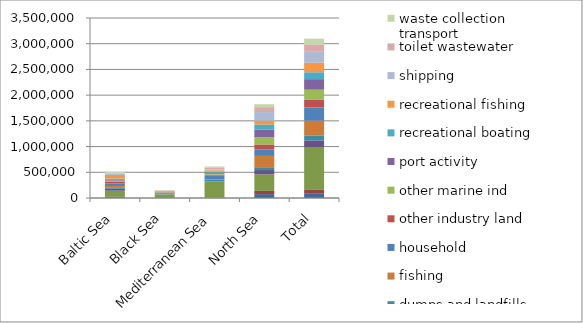
| Category | agriculture | aquaculture | coast beach tourism | construction and demolition | dumps and landfills | fishing | household | other industry land | other marine ind | port activity | recreational boating | recreational fishing | shipping | toilet wastewater | waste collection transport |
|---|---|---|---|---|---|---|---|---|---|---|---|---|---|---|---|
| Baltic Sea | 12594.5 | 8757.75 | 120616.25 | 37110 | 17418.75 | 37495.5 | 50401.5 | 28056.25 | 25624.5 | 24988.75 | 15404.5 | 69636.25 | 26660.25 | 8743.5 | 23729.5 |
| Black Sea | 1421.5 | 1011.5 | 65082.5 | 2379.75 | 6008.5 | 6593.25 | 19094.5 | 7313 | 7035 | 6863.5 | 3592.75 | 12642.75 | 6489.75 | 2937.5 | 5302.25 |
| Mediterranean Sea | 3603 | 1961.25 | 316005.25 | 5919 | 25483.25 | 15997.75 | 65346.25 | 19180.5 | 17063.5 | 22718.5 | 16351.5 | 29325 | 12328.5 | 34722.5 | 27094 |
| North Sea | 75830.75 | 61807.75 | 323328.5 | 82483.75 | 41262.25 | 233631 | 122817.25 | 100277.5 | 139505 | 151129.75 | 98141.75 | 73667.5 | 167031 | 95836 | 57699.25 |
| Total | 93449.75 | 73538.25 | 825032.5 | 127892.5 | 90172.75 | 293717.5 | 257659.5 | 154827.25 | 189228 | 205700.5 | 133490.5 | 185271.5 | 212509.5 | 142239.5 | 113825 |